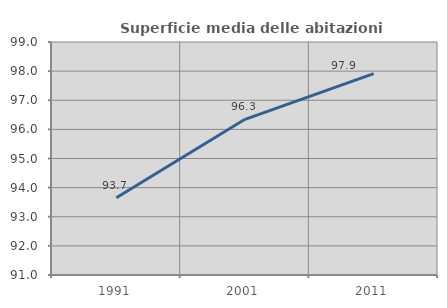
| Category | Superficie media delle abitazioni occupate |
|---|---|
| 1991.0 | 93.65 |
| 2001.0 | 96.345 |
| 2011.0 | 97.913 |